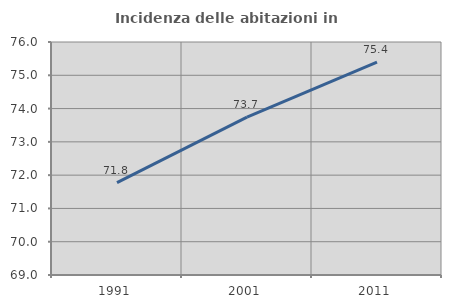
| Category | Incidenza delle abitazioni in proprietà  |
|---|---|
| 1991.0 | 71.778 |
| 2001.0 | 73.741 |
| 2011.0 | 75.396 |